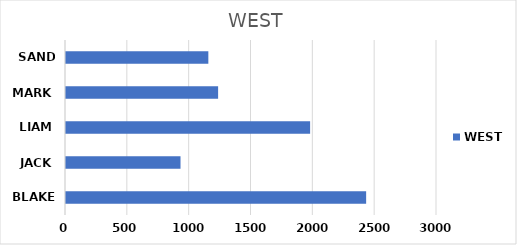
| Category | WEST |
|---|---|
| BLAKE | 2427 |
| JACK | 926 |
| LIAM | 1974 |
| MARK | 1230 |
| SANDY | 1151 |